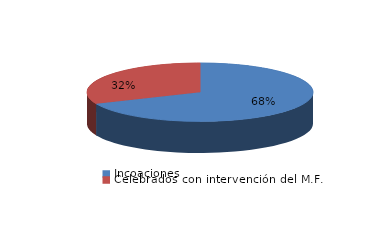
| Category | Series 0 |
|---|---|
| Incoaciones | 4587 |
| Celebrados con intervención del M.F. | 2112 |